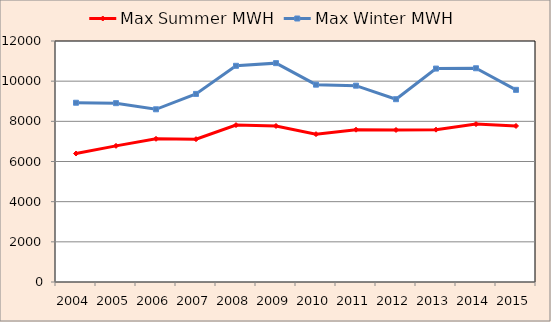
| Category | Max Summer MWH | Max Winter MWH |
|---|---|---|
| 2004.0 | 6397 | 8926 |
| 2005.0 | 6779 | 8905 |
| 2006.0 | 7129 | 8600 |
| 2007.0 | 7111 | 9365 |
| 2008.0 | 7812 | 10765 |
| 2009.0 | 7768 | 10898 |
| 2010.0 | 7362 | 9826 |
| 2011.0 | 7583 | 9776 |
| 2012.0 | 7569 | 9102 |
| 2013.0 | 7585 | 10627 |
| 2014.0 | 7861 | 10643 |
| 2015.0 | 7769 | 9568 |